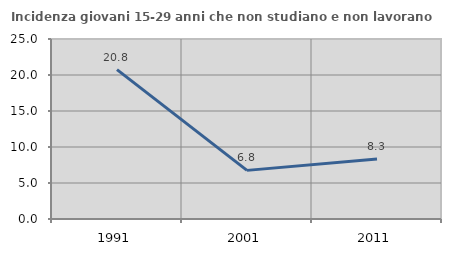
| Category | Incidenza giovani 15-29 anni che non studiano e non lavorano  |
|---|---|
| 1991.0 | 20.755 |
| 2001.0 | 6.754 |
| 2011.0 | 8.333 |